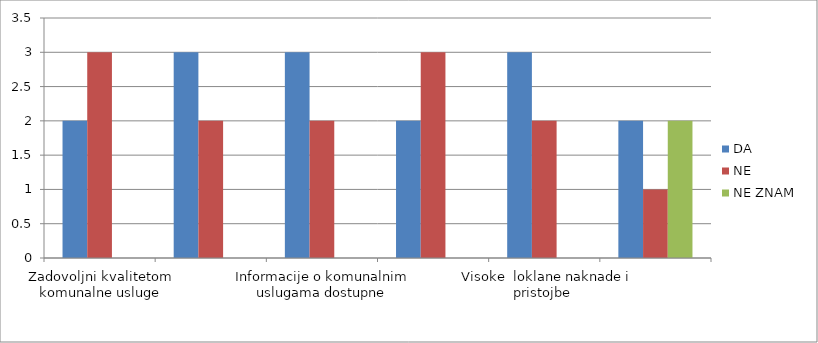
| Category | DA | NE  | NE ZNAM  |
|---|---|---|---|
| Zadovoljni kvalitetom komunalne usluge | 2 | 3 | 0 |
| Javne površine uredne i čiste | 3 | 2 | 0 |
| Informacije o komunalnim uslugama dostupne | 3 | 2 | 0 |
| Cijene komunalnih usluge primjerene | 2 | 3 | 0 |
|  Visoke  loklane naknade i pristojbe  | 3 | 2 | 0 |
| Upoznatost s izmjenama i dopunama Odluka o komunalnoj naknadi i komunalnom doprinosu  | 2 | 1 | 2 |